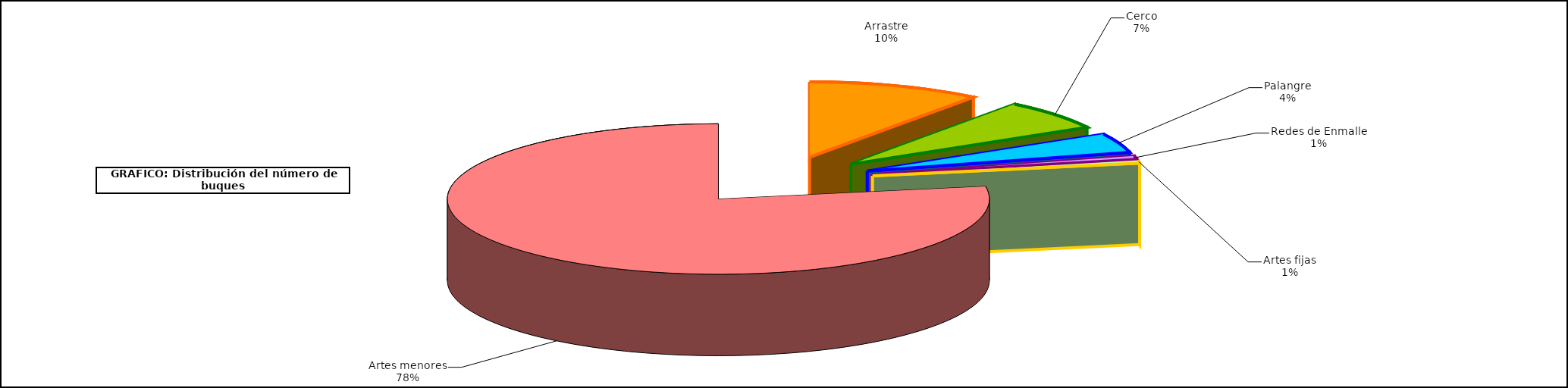
| Category | Series1 |
|---|---|
| 0 | 944 |
| 1 | 595 |
| 2 | 379 |
| 3 | 67 |
| 4 | 55 |
| 5 | 7106 |